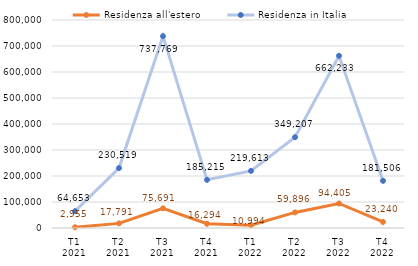
| Category | Residenza all'estero | Residenza in Italia |
|---|---|---|
| T1
2021 | 2955 | 64653 |
| T2
2021 | 17791 | 230519 |
| T3
2021 | 75691 | 737769 |
| T4
2021 | 16294 | 185215 |
| T1
2022 | 10994 | 219613 |
| T2
2022 | 59896 | 349207 |
| T3
2022 | 94405 | 662233 |
| T4
2022 | 23240 | 181506 |